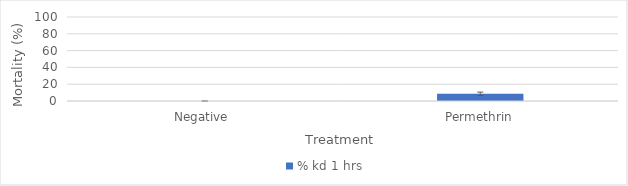
| Category | % kd 1 hrs |
|---|---|
| Negative  | 0 |
| Permethrin | 8.621 |